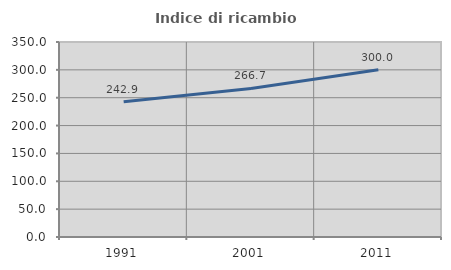
| Category | Indice di ricambio occupazionale  |
|---|---|
| 1991.0 | 242.857 |
| 2001.0 | 266.667 |
| 2011.0 | 300 |